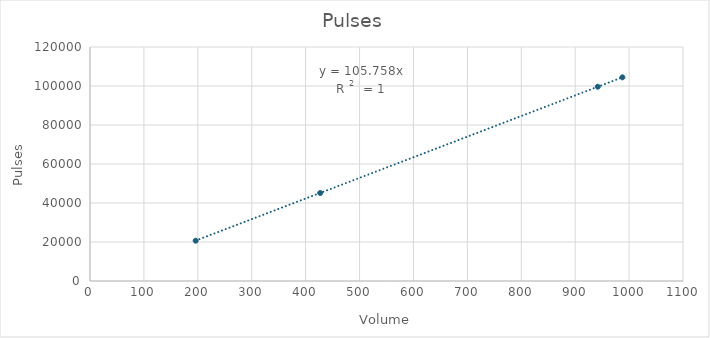
| Category | Pulses |
|---|---|
| 196.0 | 20661 |
| 427.0 | 45123 |
| 941.9 | 99639 |
| 987.6 | 104451 |